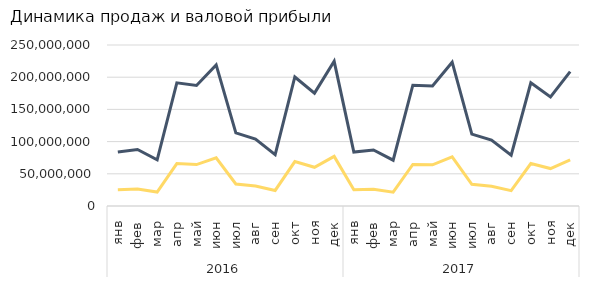
| Category | Сумма по полю Продажи без НДС | Сумма по полю Валовая прибыль |
|---|---|---|
| 0 | 83734811.441 | 25187368.538 |
| 1 | 87792131.144 | 26296846.547 |
| 2 | 71789289.407 | 21676803.178 |
| 3 | 191251090.254 | 65860710.644 |
| 4 | 187192215.678 | 64308714.576 |
| 5 | 219143725.763 | 74926245.377 |
| 6 | 113481868.644 | 34151342.797 |
| 7 | 103809169.492 | 31101897.034 |
| 8 | 79839419.492 | 24125587.288 |
| 9 | 200310635.593 | 68944182.627 |
| 10 | 175222309.322 | 60148893.22 |
| 11 | 224674186.441 | 77037477.542 |
| 12 | 83774364.407 | 25204894.068 |
| 13 | 87074936.441 | 26079980.932 |
| 14 | 71115254.237 | 21479148.305 |
| 15 | 187532966.102 | 64562566.102 |
| 16 | 186308771.186 | 63971944.915 |
| 17 | 223278622.881 | 76436538.136 |
| 18 | 111699152.542 | 33606525.424 |
| 19 | 102441101.695 | 30682330.508 |
| 20 | 79016949.153 | 23865720.339 |
| 21 | 191360169.492 | 65880169.492 |
| 22 | 169371610.169 | 58156313.559 |
| 23 | 208671610.169 | 71436016.949 |